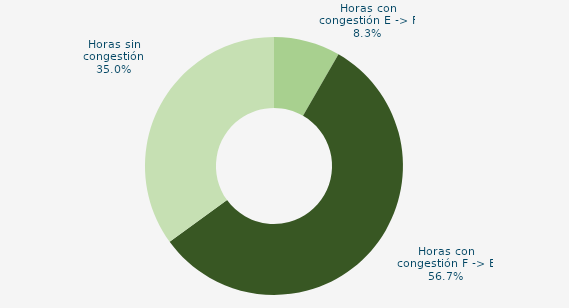
| Category | Horas con congestión E -> F |
|---|---|
| Horas con congestión E -> F | 8.333 |
| Horas con congestión F -> E | 56.667 |
| Horas sin congestión | 35 |